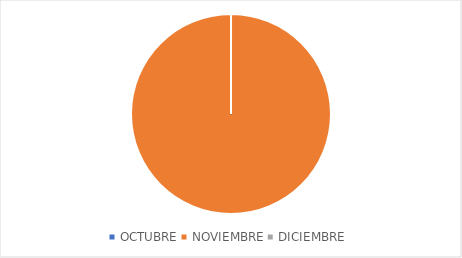
| Category | Series 0 |
|---|---|
| OCTUBRE | 0 |
| NOVIEMBRE | 1 |
| DICIEMBRE | 0 |